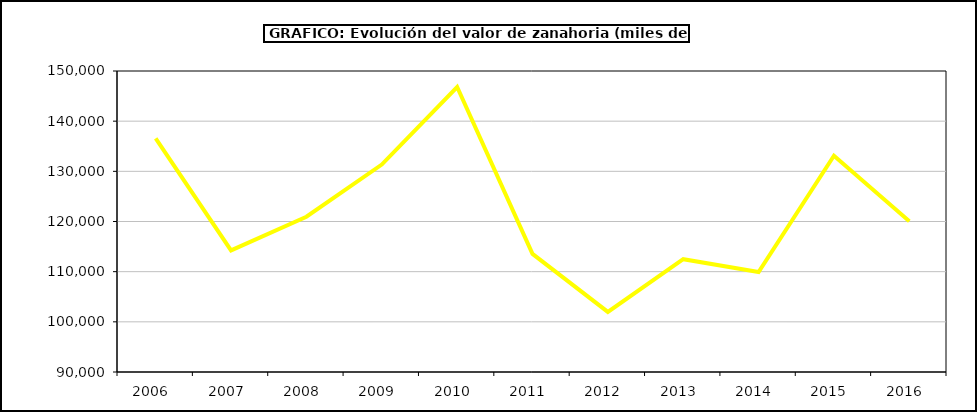
| Category | Valor |
|---|---|
| 2006.0 | 136581.569 |
| 2007.0 | 114230.439 |
| 2008.0 | 120953.143 |
| 2009.0 | 131354.206 |
| 2010.0 | 146811.606 |
| 2011.0 | 113537.975 |
| 2012.0 | 101980.864 |
| 2013.0 | 112485.085 |
| 2014.0 | 109919.203 |
| 2015.0 | 133120 |
| 2016.0 | 120031 |